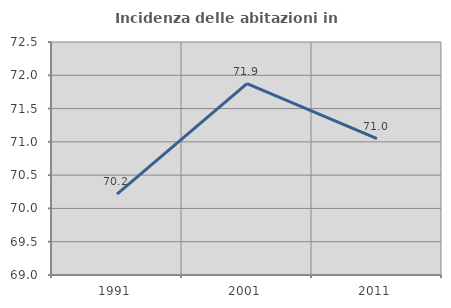
| Category | Incidenza delle abitazioni in proprietà  |
|---|---|
| 1991.0 | 70.214 |
| 2001.0 | 71.873 |
| 2011.0 | 71.047 |